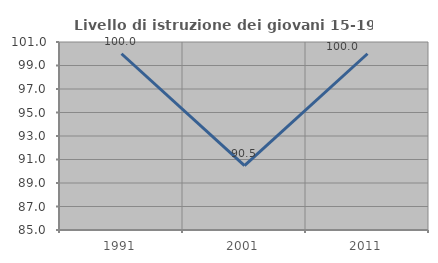
| Category | Livello di istruzione dei giovani 15-19 anni |
|---|---|
| 1991.0 | 100 |
| 2001.0 | 90.476 |
| 2011.0 | 100 |